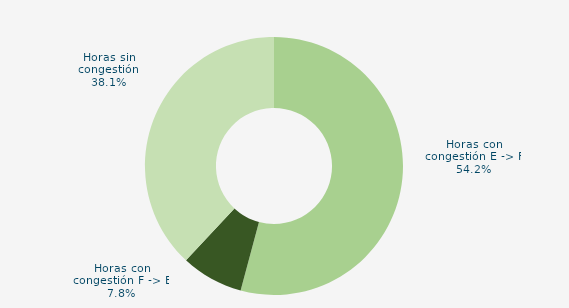
| Category | Horas con congestión E -> F |
|---|---|
| Horas con congestión E -> F | 54.167 |
| Horas con congestión F -> E | 7.778 |
| Horas sin congestión | 38.056 |